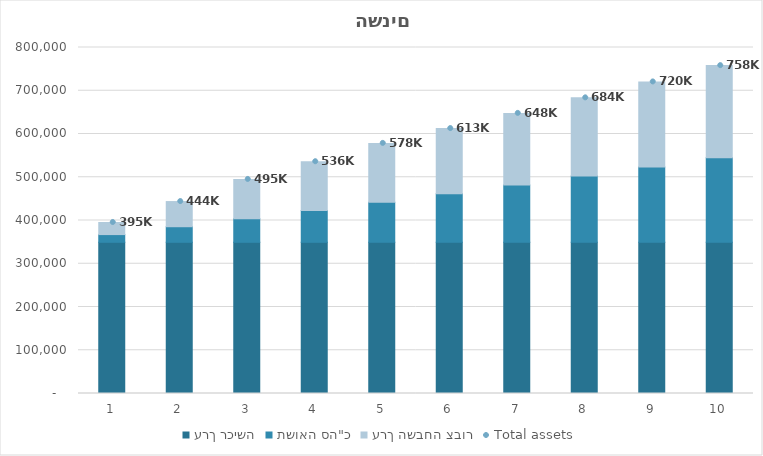
| Category | ערך רכישה | תשואה סה"כ | ערך השבחה צבור |
|---|---|---|---|
| 1.0 | 349600 | 17829.6 | 27968 |
| 2.0 | 349600 | 36015.792 | 58173.44 |
| 3.0 | 349600 | 54565.708 | 90795.315 |
| 4.0 | 349600 | 73486.622 | 112815.081 |
| 5.0 | 349600 | 92785.954 | 135935.835 |
| 6.0 | 349600 | 112471.274 | 150501.91 |
| 7.0 | 349600 | 132550.299 | 165504.967 |
| 8.0 | 349600 | 153030.905 | 180958.116 |
| 9.0 | 349600 | 173921.123 | 196874.86 |
| 10.0 | 349600 | 195229.146 | 213269.106 |